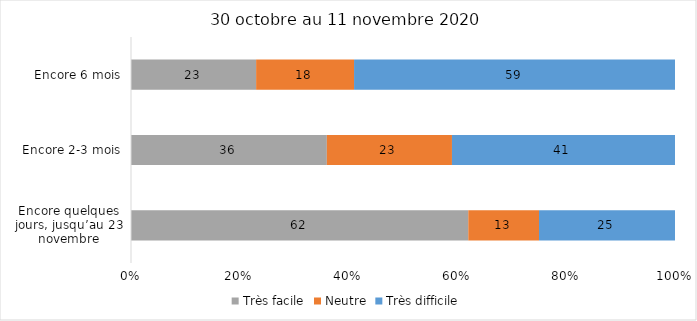
| Category | Très facile | Neutre | Très difficile |
|---|---|---|---|
| Encore quelques jours, jusqu’au 23 novembre | 62 | 13 | 25 |
| Encore 2-3 mois | 36 | 23 | 41 |
| Encore 6 mois | 23 | 18 | 59 |